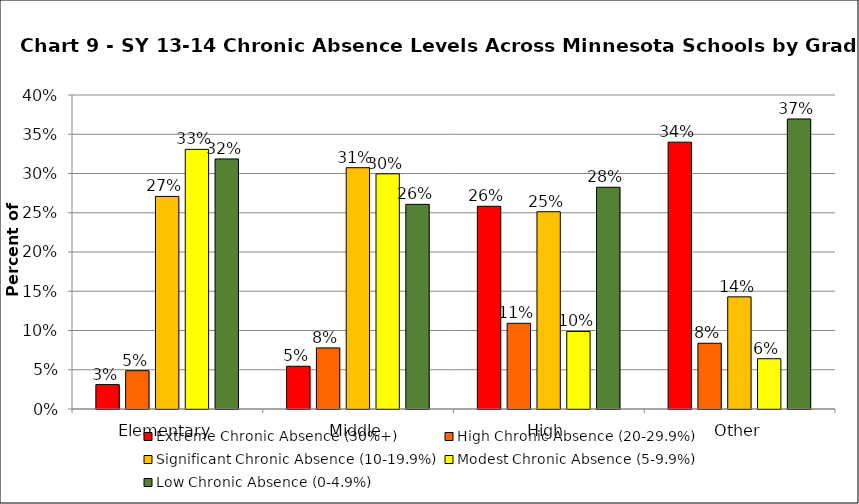
| Category | Extreme Chronic Absence (30%+) | High Chronic Absence (20-29.9%) | Significant Chronic Absence (10-19.9%) | Modest Chronic Absence (5-9.9%) | Low Chronic Absence (0-4.9%) |
|---|---|---|---|---|---|
| 0 | 0.031 | 0.049 | 0.271 | 0.331 | 0.319 |
| 1 | 0.054 | 0.078 | 0.307 | 0.3 | 0.261 |
| 2 | 0.258 | 0.109 | 0.251 | 0.099 | 0.282 |
| 3 | 0.34 | 0.084 | 0.143 | 0.064 | 0.369 |